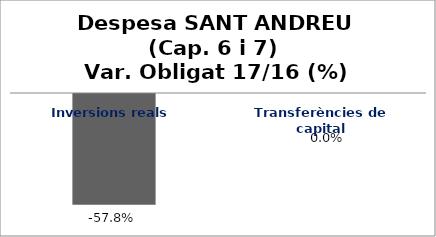
| Category | Series 0 |
|---|---|
| Inversions reals | -0.578 |
| Transferències de capital | 0 |